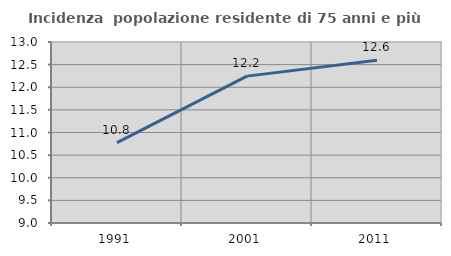
| Category | Incidenza  popolazione residente di 75 anni e più |
|---|---|
| 1991.0 | 10.778 |
| 2001.0 | 12.246 |
| 2011.0 | 12.596 |